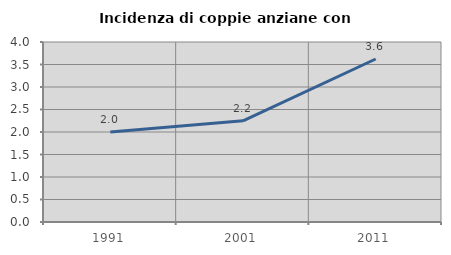
| Category | Incidenza di coppie anziane con figli |
|---|---|
| 1991.0 | 1.999 |
| 2001.0 | 2.25 |
| 2011.0 | 3.622 |